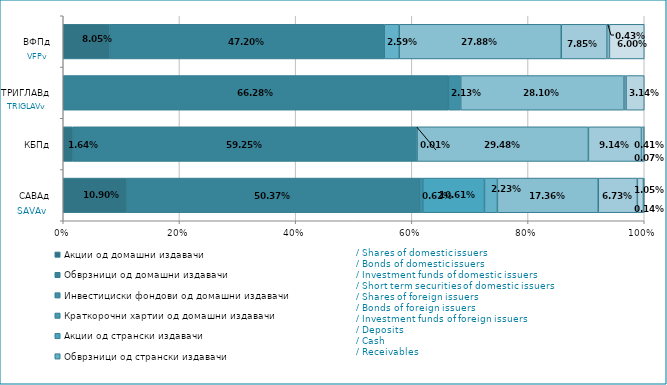
| Category | Акции од домашни издавачи  | Обврзници од домашни издавачи  | Инвестициски фондови од домашни издавачи   | Краткорочни хартии од домашни издавачи   | Акции од странски издавачи   | Обврзници од странски издавачи  | Инвестициски фондови од странски издавчи  | Депозити | Парични средства | Побарувања |
|---|---|---|---|---|---|---|---|---|---|---|
| САВАд | 0.109 | 0.504 | 0.006 | 0 | 0.106 | 0.022 | 0.174 | 0.067 | 0.011 | 0.001 |
| КБПд | 0.016 | 0.593 | 0 | 0 | 0 | 0 | 0.295 | 0.091 | 0.004 | 0.001 |
| ТРИГЛАВд | 0 | 0.663 | 0.021 | 0 | 0 | 0 | 0.281 | 0.004 | 0.031 | 0 |
| ВФПд | 0.081 | 0.472 | 0 | 0 | 0 | 0.026 | 0.279 | 0.079 | 0.004 | 0.06 |